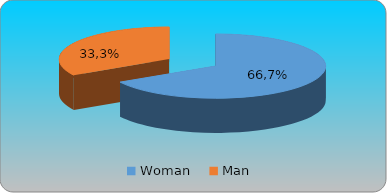
| Category | Series 0 | Series 1 | Series 2 | Series 3 |
|---|---|---|---|---|
| Woman     | 0.667 |  |  |  |
| Man  | 0.333 |  |  |  |